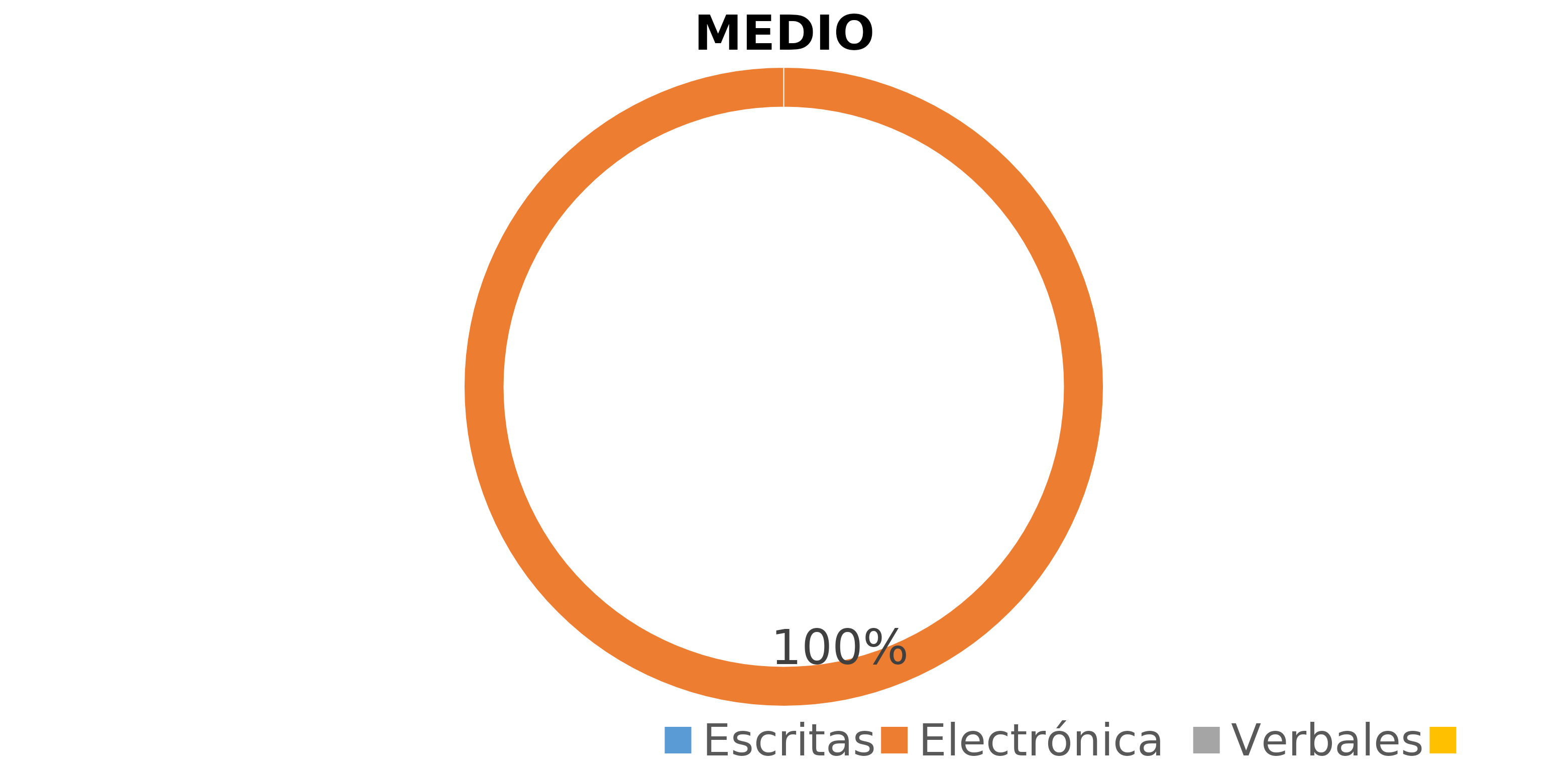
| Category | Series 0 | Series 1 |
|---|---|---|
| Escritas |  | 0 |
| Electrónicas |  | 1 |
| Verbales |  | 0 |